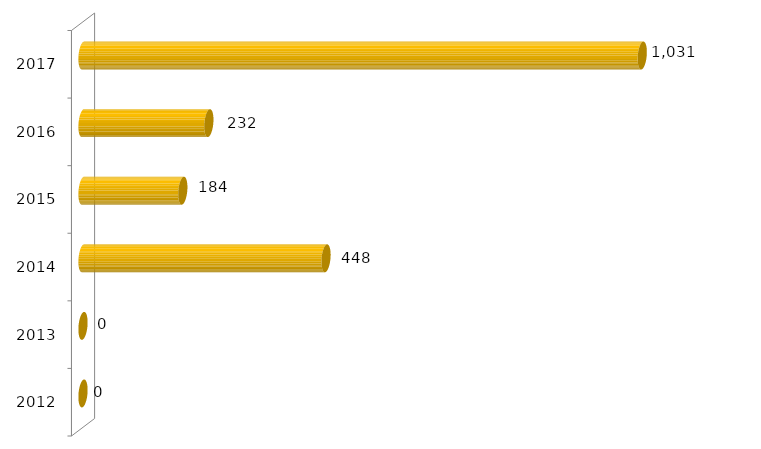
| Category | Inscritos |
|---|---|
| 2012.0 | 0 |
| 2013.0 | 0 |
| 2014.0 | 448 |
| 2015.0 | 184 |
| 2016.0 | 232 |
| 2017.0 | 1031 |